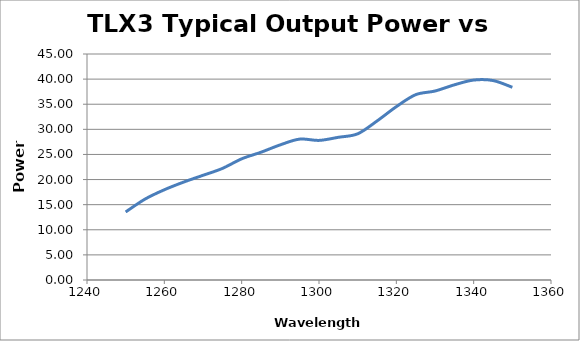
| Category | Power (mW) |
|---|---|
| 1250.0 | 13.552 |
| 1255.0 | 16.106 |
| 1260.0 | 17.968 |
| 1265.0 | 19.498 |
| 1270.0 | 20.845 |
| 1275.0 | 22.208 |
| 1280.0 | 24.127 |
| 1285.0 | 25.439 |
| 1290.0 | 26.915 |
| 1295.0 | 28.054 |
| 1300.0 | 27.797 |
| 1305.0 | 28.412 |
| 1310.0 | 29.107 |
| 1315.0 | 31.659 |
| 1320.0 | 34.514 |
| 1325.0 | 36.898 |
| 1330.0 | 37.627 |
| 1335.0 | 38.86 |
| 1340.0 | 39.811 |
| 1345.0 | 39.719 |
| 1350.0 | 38.371 |